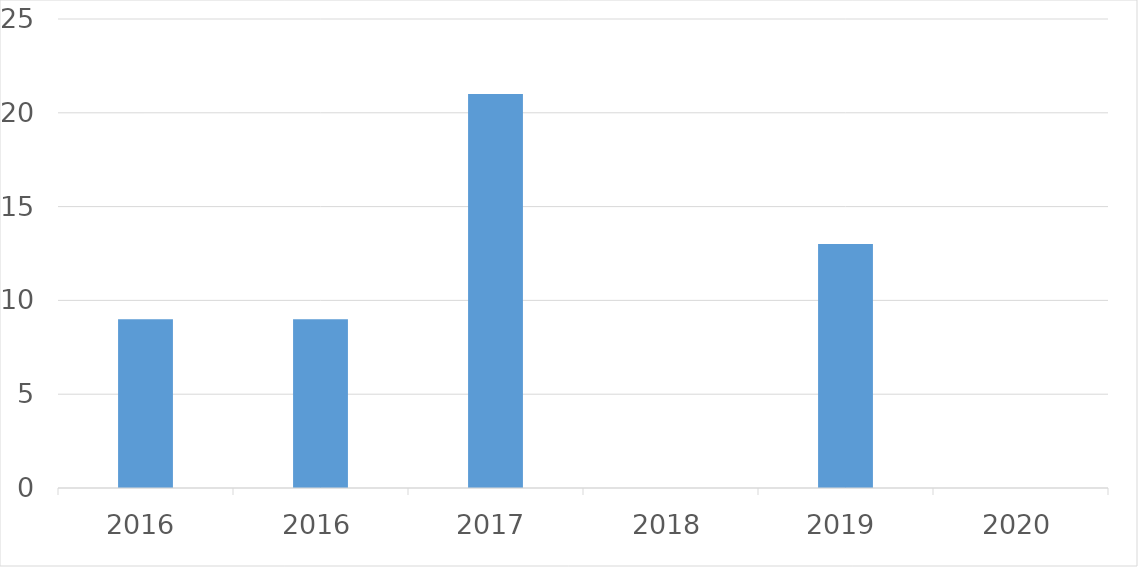
| Category | Series 0 |
|---|---|
| 2016 | 9 |
| 2016 | 9 |
| 2017 | 21 |
| 2018 | 0 |
| 2019 | 13 |
| 2020 | 0 |